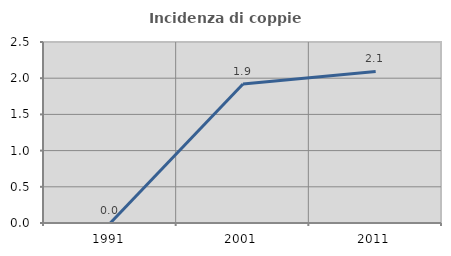
| Category | Incidenza di coppie miste |
|---|---|
| 1991.0 | 0 |
| 2001.0 | 1.919 |
| 2011.0 | 2.093 |